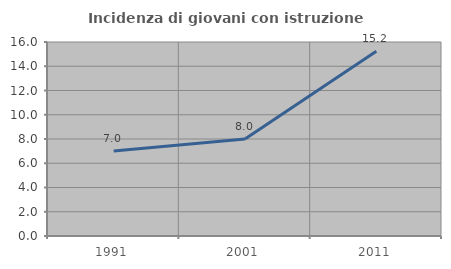
| Category | Incidenza di giovani con istruzione universitaria |
|---|---|
| 1991.0 | 7.003 |
| 2001.0 | 8 |
| 2011.0 | 15.232 |